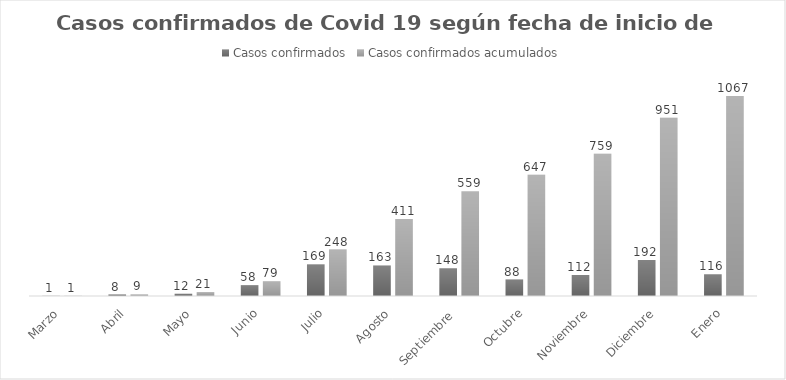
| Category | Casos confirmados | Casos confirmados acumulados |
|---|---|---|
| Marzo | 1 | 1 |
| Abril | 8 | 9 |
| Mayo | 12 | 21 |
| Junio | 58 | 79 |
| Julio | 169 | 248 |
| Agosto | 163 | 411 |
| Septiembre  | 148 | 559 |
| Octubre | 88 | 647 |
| Noviembre | 112 | 759 |
| Diciembre | 192 | 951 |
| Enero | 116 | 1067 |